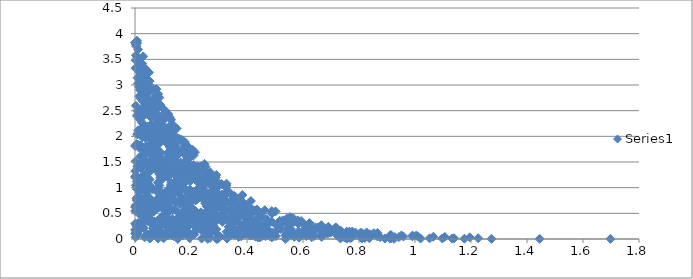
| Category | Series 0 |
|---|---|
| 0.03716779105537421 | 1.003 |
| 0.008822513951496299 | 0.594 |
| 0.017440346820701655 | 1.151 |
| 0.17022369226318276 | 0.327 |
| 0.12895083027089796 | 0.157 |
| 0.09529452116617862 | 0.103 |
| 0.17792396358843135 | 1.823 |
| 0.00026709726787869123 | 0.545 |
| 0.5037541486432635 | 0.274 |
| 0.022506898909260813 | 0.782 |
| 0.8271030406833584 | 0.128 |
| 0.24890674233535257 | 1.345 |
| 0.060093010679022854 | 2.917 |
| 0.22339347148819338 | 1.296 |
| 0.3895400718604784 | 0.631 |
| 0.14147961460940833 | 1.745 |
| 0.9105913933228816 | 0.06 |
| 0.30898676331521885 | 0.863 |
| 0.15679617692178696 | 0.185 |
| 0.08033601282501691 | 2.001 |
| 0.2502979704826458 | 0.779 |
| 0.06808265911801281 | 1.626 |
| 0.5827822408973338 | 0.098 |
| 0.3293461391938041 | 0.731 |
| 0.5535265823665415 | 0.425 |
| 0.11116832625523443 | 0.394 |
| 0.8756790933497893 | 0.037 |
| 0.47677865397592234 | 0.172 |
| 0.35409245493574093 | 0.819 |
| 0.0020778300588985828 | 3.826 |
| 0.02966008064252477 | 3.035 |
| 0.17051384992014326 | 0.683 |
| 0.05861140684196604 | 2.684 |
| 0.12362721254603497 | 1.335 |
| 0.381937015799947 | 0.609 |
| 0.06816264699061637 | 1.785 |
| 0.11652623806145941 | 0.757 |
| 0.10225927061371172 | 0.015 |
| 0.11679399065044489 | 1.341 |
| 0.35570513184533514 | 0.197 |
| 0.006196184182909808 | 1.18 |
| 0.031524972638640174 | 1.04 |
| 0.17890876989443738 | 0.57 |
| 0.245337641208643 | 0.964 |
| 0.07865409892080753 | 2.6 |
| 0.29899747610851335 | 0.788 |
| 0.40432980913844796 | 0.606 |
| 0.249834324769076 | 1.316 |
| 0.0959753202738611 | 0.437 |
| 0.08106289892159264 | 0.981 |
| 0.7306157474795294 | 0.08 |
| 0.5461467781380296 | 0.043 |
| 0.6066587686294266 | 0.203 |
| 0.3124660066139574 | 0.334 |
| 0.23462266587301703 | 0.183 |
| 0.1013118378665841 | 0.428 |
| 0.16136983917486147 | 0.312 |
| 0.17910867924870708 | 1.787 |
| 0.18288134163199576 | 0.504 |
| 0.7335642219753171 | 0.163 |
| 0.02612233544202179 | 1.427 |
| 0.055472756976770704 | 1.456 |
| 0.1382115806041153 | 0.057 |
| 0.33825774308012385 | 0.322 |
| 0.11018860445374318 | 1.544 |
| 0.38530447687380276 | 0.273 |
| 0.3677947456910518 | 0.538 |
| 0.006974025406046639 | 2.398 |
| 0.11286268094486931 | 0.652 |
| 0.025795917813539345 | 1.09 |
| 0.32067438395224784 | 0.408 |
| 0.01698311568460561 | 2.33 |
| 0.19594917026551936 | 1.405 |
| 1.0198910380000974 | 0.009 |
| 0.053247826091861954 | 0.796 |
| 0.1520199435705219 | 0.531 |
| 0.02400793750252171 | 2.098 |
| 0.010206159170048886 | 3.028 |
| 0.1430537871859116 | 1.381 |
| 0.13377346740702775 | 0.394 |
| 0.33537718631001906 | 0.916 |
| 0.6548392543937742 | 0.227 |
| 0.3829382441158842 | 0.463 |
| 0.005245590731129907 | 0.797 |
| 0.48086529905668535 | 0.061 |
| 0.21635298919688242 | 0.751 |
| 0.2855961458978222 | 0.956 |
| 0.28994169256592467 | 0.191 |
| 0.11744493646571584 | 0.095 |
| 0.6458889710088062 | 0.196 |
| 0.27151481187076737 | 0.746 |
| 0.18226509787742487 | 0.211 |
| 0.02852945662145855 | 2.754 |
| 0.00013079454320566965 | 1.813 |
| 0.22524912294621693 | 1.099 |
| 1.1956743073371698 | 0.032 |
| 0.05918327649251201 | 0.126 |
| 0.10462263162822266 | 1.259 |
| 0.10511013658130071 | 1.967 |
| 0.36283538470530247 | 0.133 |
| 0.15497898951619157 | 0.887 |
| 0.35753960904721327 | 0.791 |
| 0.24090935061974092 | 1.392 |
| 0.07127850701558403 | 1.57 |
| 0.14923120332300427 | 1.762 |
| 0.26710071894973947 | 0.119 |
| 0.08736728220929026 | 1.042 |
| 0.13260849562084326 | 0.165 |
| 0.08284844797718813 | 0.896 |
| 0.1458223046683311 | 1.873 |
| 0.18817317799327019 | 0.865 |
| 0.0020434962603495775 | 1.513 |
| 0.09101854342133854 | 2.587 |
| 0.07609185082655578 | 2.064 |
| 0.2942769087865759 | 1.088 |
| 0.29906369066180527 | 1.083 |
| 0.149153338595426 | 1.32 |
| 0.38542013438350786 | 0.666 |
| 0.4413566355533724 | 0.494 |
| 0.07306176098024425 | 2.21 |
| 0.3494748110921651 | 0.43 |
| 0.08276751506915996 | 0.19 |
| 0.22712539898009598 | 0.902 |
| 0.0006745500513479101 | 1.323 |
| 0.17262999416177874 | 1.005 |
| 0.6230589331876341 | 0.309 |
| 0.1547682777703408 | 0.17 |
| 0.7336054182727688 | 0.011 |
| 0.07923835660876469 | 2.66 |
| 0.41115429861618336 | 0.491 |
| 0.11034985703787542 | 0.297 |
| 0.040551021394957504 | 0.888 |
| 0.1875877412656188 | 1.487 |
| 0.19464441217544154 | 0.018 |
| 0.0028589166457402304 | 2.596 |
| 0.08918855800100119 | 1.513 |
| 0.3686093808253029 | 0.453 |
| 0.0239982620997441 | 2.545 |
| 0.05214795206652271 | 0.641 |
| 0.5833180298340916 | 0.297 |
| 0.05480160666144429 | 2.138 |
| 0.23628357006895226 | 1.417 |
| 0.11619212245185592 | 1.203 |
| 0.4272434878211761 | 0.366 |
| 0.1499827470340684 | 1.155 |
| 0.3405440371813204 | 0.403 |
| 0.1720330971606895 | 0.31 |
| 0.033279440813235854 | 0.367 |
| 0.1946025702511996 | 0.268 |
| 0.7178854686342163 | 0.226 |
| 0.12884609317756662 | 0.737 |
| 0.2885427520475441 | 1.202 |
| 0.31812049561085787 | 0.848 |
| 0.14779922449262725 | 1.145 |
| 0.31335921348907914 | 0.756 |
| 0.04932888710436688 | 2.037 |
| 0.7422273057086468 | 0.076 |
| 0.5598810613250808 | 0.107 |
| 0.29088883487643735 | 0.003 |
| 0.3557075392490004 | 0.328 |
| 0.1780591453059112 | 1.802 |
| 0.7193530408202823 | 0.217 |
| 0.11093221485179029 | 0.491 |
| 1.2256007013273058 | 0.016 |
| 0.03938512955973538 | 1.669 |
| 0.09105509829613553 | 0.393 |
| 0.05892334042832206 | 0.631 |
| 0.13584251992623664 | 1.58 |
| 0.014068779985967568 | 0.295 |
| 0.0936399020989678 | 1.146 |
| 0.3622323048185482 | 0.44 |
| 0.1530639118228843 | 1.331 |
| 0.8363566081524443 | 0.017 |
| 0.2744490574938887 | 0.338 |
| 0.19484377101761904 | 0.907 |
| 0.47801289767294725 | 0.308 |
| 0.8397731794458401 | 0.092 |
| 0.22163530127918993 | 1.336 |
| 0.10863243078479147 | 2.499 |
| 0.11908949911724052 | 2.432 |
| 0.019912145491013493 | 0.458 |
| 0.27168919568188227 | 0.409 |
| 0.3991621883068954 | 0.501 |
| 0.0034325451189713683 | 1.236 |
| 1.697984097208112 | 0.002 |
| 0.07634959802859953 | 2.45 |
| 0.11196156723098348 | 0.14 |
| 0.16071668767669117 | 0.68 |
| 0.08535568177087063 | 1.851 |
| 0.058697802035076095 | 2.235 |
| 0.03775842040024851 | 1.97 |
| 0.37683912678513254 | 0.458 |
| 0.03895799616460039 | 1.19 |
| 0.1730643470640195 | 1.284 |
| 0.22361830337121064 | 1.414 |
| 0.756488085402464 | 0.091 |
| 0.612011741465729 | 0.057 |
| 0.44596541491924946 | 0.085 |
| 0.27468770737461673 | 0.681 |
| 0.1697849161967167 | 1.012 |
| 0.0764582020089775 | 2.92 |
| 0.03943157331568232 | 1.811 |
| 0.12940509774165765 | 1.092 |
| 0.5689781128821074 | 0.041 |
| 0.07300009264635163 | 0.564 |
| 0.0010446542353439487 | 1.221 |
| 0.5505899982377189 | 0.271 |
| 0.2330120737092051 | 1.079 |
| 0.3980308495811225 | 0.155 |
| 0.28270408481594433 | 0.155 |
| 0.19607328636718516 | 0.966 |
| 0.055104085455140124 | 0.311 |
| 0.3158976162985328 | 0.604 |
| 0.028335296095916677 | 2.392 |
| 0.044759114639264734 | 2.493 |
| 0.22155434159775922 | 0.771 |
| 1.0522134636277525 | 0.013 |
| 0.10131654618310945 | 2.01 |
| 0.24424135845833136 | 1.348 |
| 0.04394392483629507 | 0.353 |
| 0.26808694218748563 | 0.023 |
| 0.17528862848102417 | 1.669 |
| 0.13596899018793288 | 0.088 |
| 0.026837098217934296 | 2.907 |
| 0.6140876071222231 | 0.229 |
| 0.2502499511543098 | 0.464 |
| 0.06080359942958964 | 2.02 |
| 0.8924941658065707 | 0.009 |
| 0.01922850289631349 | 3.32 |
| 0.24874327869718788 | 0.137 |
| 0.45877686867636175 | 0.198 |
| 0.2702524136993201 | 0.315 |
| 0.9911504805643827 | 0.067 |
| 0.3667194221961769 | 0.341 |
| 0.1281191551737167 | 1.267 |
| 0.21848779366111384 | 0.165 |
| 0.043171394131907265 | 0.5 |
| 0.3438430820743103 | 0.866 |
| 0.14252941290550034 | 1.821 |
| 0.37642321324947403 | 0.229 |
| 0.26816307991313776 | 1.302 |
| 0.27997516022547575 | 1.027 |
| 0.0562893401099493 | 2.657 |
| 0.025728552335381863 | 3.417 |
| 0.46595198973635943 | 0.056 |
| 0.05378303481719533 | 2.462 |
| 0.5420552719728263 | 0.398 |
| 0.043251053186384454 | 2.735 |
| 0.26290564498261365 | 0.258 |
| 0.028833375186291456 | 0.647 |
| 0.012064280015961255 | 3.438 |
| 1.0090411865269449 | 0.054 |
| 0.003381607281538869 | 0.29 |
| 0.01550398556215852 | 2.782 |
| 0.138999881838892 | 0.269 |
| 0.38339558230897547 | 0.859 |
| 0.25695879837196134 | 1.271 |
| 0.12971052856652157 | 1.362 |
| 0.09713718785048914 | 0.067 |
| 0.14597383380660106 | 1.492 |
| 0.19706833260916073 | 1.123 |
| 0.8096562643309575 | 0.01 |
| 0.06861633694017835 | 1.857 |
| 0.49811927472803125 | 0.068 |
| 0.03928240309270699 | 2.433 |
| 0.0504730490682628 | 1.345 |
| 0.03101425161150037 | 1.255 |
| 0.24410542953311987 | 0.381 |
| 0.2821960674724906 | 1.118 |
| 0.021463063985319598 | 0.787 |
| 0.2617455917209899 | 0.525 |
| 0.08889547019604792 | 2.044 |
| 0.11261755384455845 | 0.299 |
| 0.17749182856709433 | 1.855 |
| 0.04764450486380906 | 1.816 |
| 0.5031948396537179 | 0.056 |
| 0.8403247590286397 | 0.04 |
| 0.690296965879602 | 0.238 |
| 0.12545945177456969 | 1.783 |
| 0.28515777786221563 | 0.453 |
| 0.4402939049402467 | 0.205 |
| 0.2598569962264931 | 0.003 |
| 0.1399414969379703 | 1.803 |
| 0.02579907774972698 | 2.037 |
| 0.1929155879455223 | 0.757 |
| 0.3081127265022092 | 0.478 |
| 0.2618285796804837 | 1.162 |
| 0.5451997041991578 | 0.308 |
| 0.034135566795484025 | 0.034 |
| 0.22854350278876237 | 0.438 |
| 0.22695108041500367 | 1.223 |
| 0.029028356388965573 | 1.747 |
| 0.03713370581039943 | 0.926 |
| 0.03844488595252487 | 2.991 |
| 0.029406822840174256 | 1.213 |
| 0.18241049202749346 | 0.705 |
| 0.09723041491832057 | 0.716 |
| 0.3518108209681101 | 0.381 |
| 0.23575629864084668 | 0.252 |
| 0.1262118214533976 | 0.748 |
| 0.26011650770147376 | 0.432 |
| 0.2516788758774388 | 1.411 |
| 0.23547073507659688 | 0.52 |
| 0.07485947744282745 | 0.301 |
| 0.5466850526001145 | 0.211 |
| 0.19724550649564637 | 1.753 |
| 0.43030904119972746 | 0.047 |
| 0.01571909132883207 | 0.174 |
| 0.17796167315414027 | 1.889 |
| 0.09467851680912315 | 1.454 |
| 0.031203615662103012 | 2.147 |
| 0.4642817238532101 | 0.387 |
| 0.7797710987891713 | 0.078 |
| 0.35819470930476893 | 0.727 |
| 0.5897184866335335 | 0.047 |
| 0.4889151535941082 | 0.338 |
| 0.12175787851587304 | 1.268 |
| 0.1881024254166603 | 1.804 |
| 0.07292503684942839 | 0.744 |
| 0.0022231464086416566 | 3.481 |
| 0.09040887204534352 | 0.839 |
| 0.5202870509027124 | 0.195 |
| 0.6670391041519752 | 0.041 |
| 1.0042767724553114 | 0.066 |
| 0.488552532201586 | 0.544 |
| 0.13260030746197266 | 0.072 |
| 0.020057714630300802 | 1.614 |
| 0.08883654509188993 | 0.241 |
| 0.003992225088224762 | 0.137 |
| 0.18839935398352578 | 0.242 |
| 0.7475943097023736 | 0.033 |
| 0.25606257571745183 | 0.266 |
| 0.27371642358528514 | 0.412 |
| 0.11918552155827256 | 0.86 |
| 0.8202883268615183 | 0.017 |
| 0.02961133817398603 | 3.191 |
| 0.2801048426662763 | 0.32 |
| 0.14995982192992824 | 1.216 |
| 0.19692163934186185 | 0.366 |
| 0.10511195209876262 | 1.546 |
| 0.5934911871697041 | 0.349 |
| 0.01694383420503283 | 0.979 |
| 0.45131160250555313 | 0.048 |
| 0.3122530354347572 | 0.806 |
| 0.17139244416193486 | 1.086 |
| 0.2815709871404968 | 0.34 |
| 0.0016469690047473844 | 1.199 |
| 0.2859885000924808 | 0.721 |
| 0.16595864625938825 | 0.944 |
| 0.3309198108981538 | 0.085 |
| 0.08974878711307308 | 0.919 |
| 0.1150413381362838 | 1.888 |
| 0.11716615477223524 | 0.644 |
| 0.06193881127510273 | 2.575 |
| 0.8657385135362866 | 0.05 |
| 0.008068520955331887 | 1.414 |
| 0.20287094209759182 | 0.473 |
| 0.27909958880454533 | 0.192 |
| 0.021122531715865502 | 1.039 |
| 0.007595292799149603 | 3.82 |
| 0.11082743315891765 | 0.686 |
| 0.2138652953841197 | 0.805 |
| 1.1325389757008482 | 0.008 |
| 0.7225976298654383 | 0.066 |
| 0.03995966811524169 | 2.761 |
| 1.1062645493199872 | 0.042 |
| 0.39752387226475466 | 0.444 |
| 0.010986536087277562 | 2.118 |
| 0.05203766892625499 | 2.396 |
| 0.43529640128976366 | 0.576 |
| 0.7759608099303881 | 0.145 |
| 0.0021260168517038716 | 0.035 |
| 0.002666228610356424 | 0.656 |
| 0.4021857021678105 | 0.456 |
| 0.0827803206851457 | 0.01 |
| 0.08308544189366565 | 1.671 |
| 0.22444312684525722 | 0.391 |
| 0.5018554989098276 | 0.537 |
| 0.06853552002282795 | 2.692 |
| 0.3979070827768982 | 0.497 |
| 0.8532637877803437 | 0.114 |
| 0.2380104381719759 | 0.009 |
| 0.3807326176784516 | 0.22 |
| 0.00712907373995764 | 3.863 |
| 0.05384232653302219 | 0.01 |
| 0.21295775935913677 | 0.251 |
| 0.2786123533464632 | 0.265 |
| 0.2841939452605816 | 0.503 |
| 0.911461207609207 | 0.072 |
| 0.4340562192297507 | 0.177 |
| 0.25710543363966665 | 0.782 |
| 0.10247460690875075 | 1.205 |
| 0.7725083907962065 | 0.025 |
| 0.4709741726834923 | 0.386 |
| 0.17006921457682703 | 0.26 |
| 0.13803577999090855 | 0.886 |
| 0.32370911358471666 | 1.027 |
| 0.016229788072481356 | 0.543 |
| 0.025980905838937186 | 1.042 |
| 0.11790758108859042 | 0.073 |
| 0.9139609633857955 | 0.02 |
| 0.11890164180535978 | 0.515 |
| 0.33139696672257823 | 0.926 |
| 0.41702086525999854 | 0.232 |
| 0.23398124858026345 | 0.213 |
| 0.020624733829223706 | 1.824 |
| 0.04345683338732543 | 2.189 |
| 0.5976692322756694 | 0.32 |
| 0.7158433667414225 | 0.221 |
| 0.024327264538763087 | 2.273 |
| 0.005685869806571406 | 1.848 |
| 0.2917686035849131 | 0.909 |
| 0.04084030600399222 | 1.002 |
| 0.5312813353171172 | 0.333 |
| 0.08891631622923195 | 1.578 |
| 0.05474775009133251 | 2.168 |
| 0.1421282457922648 | 0.572 |
| 0.035837866035855634 | 0.64 |
| 0.34603145032225047 | 0.53 |
| 0.09941171173777597 | 0.883 |
| 0.20312725862471187 | 0.367 |
| 0.6306362521282733 | 0.203 |
| 0.4123611103623083 | 0.345 |
| 0.1463599413614377 | 1.507 |
| 0.3260970376300381 | 1.049 |
| 0.01227492071198039 | 2.491 |
| 0.10140303820866761 | 2.059 |
| 0.009303692707600583 | 0.654 |
| 0.10621720557090165 | 0.737 |
| 0.7010732348205317 | 0.167 |
| 0.6982352904308397 | 0.125 |
| 1.2732761207781422 | 0.003 |
| 0.3479677728534355 | 0.2 |
| 0.04251380113754696 | 0.5 |
| 0.5417889625997556 | 0.117 |
| 0.09230618546415853 | 2.588 |
| 0.11047957152993328 | 1.924 |
| 0.4152169437105103 | 0.067 |
| 0.01969334936462216 | 2.406 |
| 0.2879424483647088 | 0.812 |
| 0.4128390716226218 | 0.078 |
| 0.028072535174833706 | 2.684 |
| 0.060673217469737625 | 2.946 |
| 0.09312166202696877 | 2.347 |
| 0.2467391068889866 | 0.495 |
| 0.2486951579787339 | 1.137 |
| 0.7839242012826562 | 0.07 |
| 0.1835436744465571 | 1.133 |
| 0.6646996710072121 | 0.153 |
| 0.09783521253804374 | 0.739 |
| 0.04189776383318772 | 0.723 |
| 0.02603695020988475 | 1.081 |
| 1.0974891644731306 | 0.011 |
| 0.20232650761918547 | 1.167 |
| 0.0007017476355041736 | 0.298 |
| 0.08614202769742578 | 1.993 |
| 0.08984454155099916 | 2.615 |
| 0.03179476107291295 | 2.112 |
| 0.08193974413929282 | 0.183 |
| 0.21135011629478526 | 0.087 |
| 0.9585460755699174 | 0.048 |
| 0.16632243070270006 | 0.503 |
| 0.29458671818147025 | 0.61 |
| 0.3127447116179327 | 0.867 |
| 0.2365378385694493 | 0.475 |
| 0.18367164417436657 | 0.13 |
| 0.6321951526103338 | 0.173 |
| 0.0454305544480689 | 0.09 |
| 0.4458042901326202 | 0.46 |
| 0.2018090609809474 | 1.308 |
| 0.5859569090616136 | 0.027 |
| 0.04906398215872399 | 1.159 |
| 0.41301916704339436 | 0.485 |
| 0.25062453496038334 | 0.379 |
| 0.5939715387477464 | 0.102 |
| 0.23413190686269184 | 0.467 |
| 0.4887596240539266 | 0.495 |
| 0.09445002207283087 | 1.371 |
| 0.16269546904348786 | 1.442 |
| 0.6653577440568421 | 0.147 |
| 0.5200700031214228 | 0.271 |
| 0.4195118187250483 | 0.34 |
| 0.7657519941167241 | 0.143 |
| 0.210370943572554 | 0.48 |
| 0.020695306067518696 | 3.146 |
| 0.13509006018958594 | 0.973 |
| 0.2201405606101229 | 1.379 |
| 0.17417842724000926 | 1.384 |
| 0.25551712955861555 | 0.64 |
| 0.10140871169402188 | 1.339 |
| 0.2927138460542423 | 1.04 |
| 0.026327871316478294 | 1.98 |
| 0.9238489467627088 | 0.018 |
| 0.26974148342634086 | 0.386 |
| 0.40902469682625375 | 0.618 |
| 1.1764100534764306 | 0.007 |
| 0.11595483535451995 | 2.005 |
| 0.12277817779949597 | 0.34 |
| 0.3372348218994281 | 0.577 |
| 0.13602180480439377 | 0.776 |
| 0.008208924567196988 | 2.497 |
| 0.10463018861818472 | 0.559 |
| 0.20852764962788065 | 1.441 |
| 0.047916422869177036 | 3.254 |
| 0.062033854383424625 | 1.655 |
| 0.24421485738198445 | 1.051 |
| 0.5601967209651089 | 0.367 |
| 0.030909691733109843 | 2.802 |
| 0.03489514419552418 | 0.556 |
| 0.1137260270979722 | 1.43 |
| 0.2567070768957062 | 0.514 |
| 0.025545773585839135 | 3.032 |
| 0.06206303932683439 | 0.968 |
| 0.13680830848796732 | 1.523 |
| 0.26566211189441313 | 0.63 |
| 0.6986633638158869 | 0.128 |
| 0.35152629538614116 | 0.211 |
| 0.18299766864462877 | 0.271 |
| 0.1229255713920644 | 2.194 |
| 0.22229281001258033 | 0.968 |
| 0.22236679529137746 | 0.399 |
| 0.07832633893802536 | 0.689 |
| 0.20922581183316494 | 1.63 |
| 0.003515012872298476 | 3.579 |
| 0.3988778402662023 | 0.606 |
| 0.13794422636950995 | 2.209 |
| 0.30359212337576474 | 0.046 |
| 0.00024369786268822502 | 0.105 |
| 0.43923498052058685 | 0.321 |
| 0.28573720691190085 | 0.863 |
| 0.1916312212293133 | 0.335 |
| 0.12439715066635122 | 1.948 |
| 0.06065735016213561 | 1.575 |
| 0.4687810609422315 | 0.188 |
| 0.37917048567553435 | 0.052 |
| 0.10402270084478975 | 0.461 |
| 0.01934661198154567 | 2.741 |
| 0.08850128107923064 | 2.125 |
| 0.0860364260035867 | 0.387 |
| 0.0200373388733097 | 0.737 |
| 0.07349479307507259 | 0.703 |
| 0.00484295620535174 | 0.254 |
| 0.07473947689779438 | 0.05 |
| 0.0727334311705122 | 2.184 |
| 0.03026840358375242 | 2.24 |
| 0.24307560027708563 | 0.213 |
| 0.23644017947399568 | 0.809 |
| 0.08428844760715917 | 2.768 |
| 0.1690959306738582 | 1.916 |
| 0.06924244361000116 | 2.122 |
| 0.018647367393502205 | 3.381 |
| 0.2703180636574822 | 0.834 |
| 0.47896349731524457 | 0.13 |
| 0.04281803737592428 | 1.082 |
| 0.4458108288756361 | 0.031 |
| 0.05959041871925094 | 2.591 |
| 0.28793129532308914 | 0.968 |
| 0.01090954729841838 | 1.2 |
| 0.03110876026707476 | 0.208 |
| 0.32875787030764286 | 0.008 |
| 0.08938607191049082 | 0.932 |
| 0.14650648654445952 | 1.603 |
| 0.2608201698767283 | 1.22 |
| 0.41689901936861634 | 0.312 |
| 0.4523581504035623 | 0.215 |
| 0.41022901998721245 | 0.169 |
| 0.06621160484938358 | 2.707 |
| 0.20613127344703905 | 0.832 |
| 0.6666276156376078 | 0.094 |
| 0.20246054858403065 | 0.741 |
| 0.0369340886537558 | 0.689 |
| 0.39271556392526347 | 0.42 |
| 0.06936148637896583 | 1.902 |
| 0.3791487887741288 | 0.235 |
| 0.2561990080227293 | 0.171 |
| 0.053205598629228815 | 1.953 |
| 0.30881711037863124 | 1.074 |
| 0.37010590724318637 | 0.04 |
| 0.1384244599484686 | 0.346 |
| 0.9119017637282334 | 0.008 |
| 0.3985137856393509 | 0.334 |
| 0.3075467911978684 | 0.445 |
| 0.4054748043526955 | 0.153 |
| 0.26347843229208173 | 0.218 |
| 0.06754231831669748 | 2.176 |
| 0.15631461261375254 | 1.957 |
| 0.3945807839377512 | 0.431 |
| 0.20601368003504777 | 0.846 |
| 0.36707862275444064 | 0.448 |
| 0.6903728353935248 | 0.173 |
| 0.5371036356967726 | 0.071 |
| 0.2613392389357408 | 1.2 |
| 0.18523688202529784 | 1.318 |
| 0.17003114304811737 | 1.021 |
| 0.2259323182163849 | 1.163 |
| 0.014820483516724851 | 1.142 |
| 0.4084977634419935 | 0.072 |
| 0.29535714051936107 | 1.046 |
| 0.04946648982082836 | 3.24 |
| 0.009989576706870232 | 2.426 |
| 0.02953273859224491 | 2.18 |
| 0.07855939861233441 | 1.754 |
| 0.015367204470538097 | 0.914 |
| 0.3274039929992757 | 0.521 |
| 0.0865414461385905 | 2.752 |
| 0.37568946457676733 | 0.772 |
| 0.14136495205770552 | 1.46 |
| 0.7719703459091907 | 0.042 |
| 0.42259733916803843 | 0.077 |
| 0.9117313591729422 | 0.012 |
| 0.5109406584072923 | 0.185 |
| 0.13316844671809802 | 0.98 |
| 0.12583522712609496 | 0.808 |
| 0.1414237075625851 | 0.178 |
| 0.12881657146154057 | 2.323 |
| 0.2811523954593672 | 1.093 |
| 0.7234711610517045 | 0.119 |
| 0.06710950189339031 | 0.305 |
| 0.3551149613065293 | 0.836 |
| 0.2884692038633557 | 0.179 |
| 0.7305384314668211 | 0.071 |
| 0.09156883628841864 | 1.458 |
| 0.1443287637412168 | 0.968 |
| 0.09000720305561594 | 0.825 |
| 0.00045522408520164934 | 0.622 |
| 0.1430391567268894 | 1.928 |
| 0.4884524441579371 | 0.03 |
| 0.1503436901808152 | 0.275 |
| 0.667943581933526 | 0.208 |
| 0.09836432205489716 | 2.322 |
| 0.23794777234192988 | 0.433 |
| 0.07074612333207442 | 2.541 |
| 0.06525923446292119 | 0.206 |
| 0.047066406100545556 | 1.784 |
| 0.46260284970956894 | 0.246 |
| 0.29945972928597203 | 1.047 |
| 0.30184250236928983 | 0.629 |
| 0.10660157803332408 | 2.337 |
| 0.49413178195389507 | 0.051 |
| 0.5669103345522835 | 0.335 |
| 0.2649593771050686 | 0.102 |
| 0.03272688184005703 | 2.877 |
| 0.5275325058958806 | 0.362 |
| 0.17173965257968307 | 0.522 |
| 0.08949807706263732 | 1.658 |
| 0.22270332022894931 | 0.404 |
| 0.05754733258541032 | 2.533 |
| 0.16033951626925477 | 1.678 |
| 0.08446855667652288 | 2.237 |
| 0.28002717728606213 | 0.946 |
| 0.16308443015469473 | 1.491 |
| 0.4574317806984143 | 0.245 |
| 0.2857844806022694 | 0.813 |
| 1.0655055919595027 | 0.044 |
| 0.02653592899649379 | 2.481 |
| 0.009051594917975444 | 3.539 |
| 0.2601976832597061 | 0.706 |
| 0.0005468080459277795 | 3.83 |
| 0.6191797363235508 | 0.16 |
| 0.08168343224206145 | 2.556 |
| 0.17183099561716614 | 1.229 |
| 0.043841332366627746 | 0.088 |
| 0.056172639576574916 | 1.693 |
| 0.006417619643961405 | 1.121 |
| 0.17668183999773568 | 0.515 |
| 0.12063090898959207 | 2.107 |
| 0.1513704032609573 | 0.106 |
| 0.019050413725471442 | 2.911 |
| 0.2596739744768891 | 0.043 |
| 0.8659637118888498 | 0.119 |
| 0.3899513123391198 | 0.668 |
| 0.3023756059242577 | 0.772 |
| 0.19003096295689123 | 1.595 |
| 0.31256766891833804 | 0.363 |
| 0.26493089474688414 | 0.736 |
| 0.12407058372670868 | 1.868 |
| 0.05208888321051314 | 3.076 |
| 0.9425964561073 | 0.037 |
| 0.09110218439758834 | 1.689 |
| 0.44599909948806776 | 0.499 |
| 0.4387179005367751 | 0.034 |
| 0.08279963776231446 | 2.393 |
| 0.21621493385995688 | 0.541 |
| 0.2168209167736261 | 0.86 |
| 0.039469679391143646 | 2.563 |
| 0.1958156169797146 | 1.585 |
| 0.6695281163958579 | 0.199 |
| 0.029614567784050753 | 1.484 |
| 0.021686629391309383 | 1.377 |
| 0.6656704410626394 | 0.27 |
| 0.2680973013430924 | 1.063 |
| 0.03837573899237349 | 0.802 |
| 0.0028412069657242273 | 1.045 |
| 0.6291456357721199 | 0.074 |
| 0.20143117871469052 | 1.215 |
| 0.640128781551175 | 0.06 |
| 0.04253381376728603 | 1.132 |
| 0.08662422003861742 | 0.623 |
| 0.1422028302106584 | 0.741 |
| 0.05539207939954775 | 1.646 |
| 0.058855561606273435 | 2.553 |
| 0.07513126455683351 | 0.74 |
| 0.03927796780401924 | 2.477 |
| 0.02996889697362653 | 0.225 |
| 0.21924634863375328 | 0.516 |
| 0.031212358866408593 | 1.25 |
| 0.2609813805701413 | 0.452 |
| 0.20023826299274752 | 1.255 |
| 0.2768287648726823 | 0.741 |
| 0.9270295356629819 | 0.036 |
| 0.44427879571836504 | 0.415 |
| 0.07473059675447424 | 0.737 |
| 0.35370848185810777 | 0.149 |
| 0.3401052265809586 | 0.579 |
| 0.3811585211312444 | 0.228 |
| 0.08619839129250234 | 1.267 |
| 0.8105044339543246 | 0.116 |
| 0.2734251021705494 | 0.635 |
| 0.019225429147420252 | 1.073 |
| 0.14843543763516012 | 0.241 |
| 0.04212355516913656 | 1.432 |
| 0.10016220603370796 | 1.479 |
| 0.31714531385936606 | 0.602 |
| 0.3171852093661614 | 0.673 |
| 0.2329168931380653 | 0.338 |
| 0.35236592756984925 | 0.716 |
| 0.5607367861029855 | 0.126 |
| 0.2648349523808092 | 0.892 |
| 0.014167054699540283 | 3.518 |
| 0.05266261939361827 | 0.375 |
| 0.3962679677553977 | 0.101 |
| 0.0563051644993749 | 2.383 |
| 0.32726627647498113 | 0.141 |
| 0.7273994949452444 | 0.054 |
| 0.06591782823760127 | 1.454 |
| 0.2739531132013039 | 1.094 |
| 0.043654864414932826 | 0.54 |
| 0.16198770945229665 | 0.464 |
| 0.14220011817993095 | 0.985 |
| 0.7367694790588377 | 0.149 |
| 0.1489628100003106 | 1.266 |
| 0.1174133506219431 | 0.614 |
| 0.4917498073513423 | 0.123 |
| 0.14636290064002377 | 1.228 |
| 0.23245443657325754 | 1.344 |
| 0.2584171715543306 | 0.164 |
| 0.03593680629754447 | 1.188 |
| 0.046382117431815584 | 1.286 |
| 0.07706614963302562 | 2.182 |
| 0.20581536036724696 | 1.737 |
| 0.28444389057821806 | 0.156 |
| 0.010446828952247416 | 0.31 |
| 0.01807977968133907 | 2.902 |
| 0.1855581621243676 | 1.551 |
| 0.06879734025197451 | 0.544 |
| 0.12522878263326084 | 1.643 |
| 0.16931997174529348 | 0.067 |
| 0.1743634376037247 | 0.121 |
| 0.15179274381185323 | 1.05 |
| 0.1865638272299198 | 0.928 |
| 0.02912573091966415 | 3.557 |
| 0.23595356151488303 | 0.202 |
| 0.14864519083587416 | 0.723 |
| 0.05538348794641192 | 1.036 |
| 0.05215098133641336 | 1.159 |
| 0.11016627236550376 | 2.16 |
| 0.21819069256637127 | 0.946 |
| 0.09151994010632128 | 1.473 |
| 0.07505713765451004 | 2.596 |
| 0.5530621721139625 | 0.103 |
| 0.10254677805755594 | 2.191 |
| 0.07966791136858474 | 2.669 |
| 0.05927072554777456 | 0.506 |
| 0.11158996801571189 | 1.463 |
| 0.16662898531857046 | 0.15 |
| 0.2431224862320272 | 1.187 |
| 0.08615865440387893 | 0.164 |
| 0.723763814473683 | 0.188 |
| 0.7679619087653283 | 0.019 |
| 0.11852981566265258 | 0.963 |
| 0.03470701378529852 | 2.163 |
| 0.2953473752510192 | 0.005 |
| 0.01477302376735774 | 0.78 |
| 0.7542065012570087 | 0.133 |
| 0.8053028042414346 | 0.122 |
| 0.5837572143838259 | 0.147 |
| 0.1371868411047044 | 2.04 |
| 0.026857655030495805 | 2.465 |
| 0.19066940173853542 | 0.908 |
| 0.18482861980062465 | 1.6 |
| 0.06957747802612516 | 2.69 |
| 0.014405646881522263 | 2.964 |
| 0.18145693447563707 | 1.728 |
| 0.18814421770089385 | 0.144 |
| 0.536806590287363 | 0.001 |
| 0.03966676063010809 | 0.706 |
| 0.011034880699533588 | 3.691 |
| 1.1396351310096113 | 0.013 |
| 0.07319342157224563 | 2.791 |
| 0.03417718211563455 | 0.351 |
| 0.09959573088362368 | 0.336 |
| 0.1856126071223394 | 0.663 |
| 0.021028839770470414 | 2.145 |
| 0.4586706399800608 | 0.069 |
| 0.01671813227791694 | 3.244 |
| 0.33551786972903325 | 0.229 |
| 0.0017378800530706525 | 3.328 |
| 0.1280050588261754 | 1.051 |
| 0.02766898912569426 | 2.729 |
| 0.8135953621605108 | 0.08 |
| 0.29913192547177386 | 0.062 |
| 0.044612513005050355 | 2.651 |
| 0.10770982287494894 | 2.463 |
| 0.3382506349420586 | 0.06 |
| 0.18305217238249577 | 0.624 |
| 0.2044612213059334 | 1.696 |
| 0.35998597947585764 | 0.659 |
| 0.9143442322121333 | 0.076 |
| 0.20548778630962627 | 0.076 |
| 0.008752105379052027 | 3.14 |
| 0.22432527534550564 | 0.973 |
| 0.15253685259854807 | 0.087 |
| 0.4941096059831081 | 0.063 |
| 0.004505409893572001 | 3.756 |
| 0.756940564406272 | 0.139 |
| 0.5641575663696542 | 0.408 |
| 0.06707405312696392 | 2.487 |
| 0.15274628335510018 | 0.001 |
| 0.0301993843154612 | 2.943 |
| 0.7539701308604306 | 0.047 |
| 0.631284048140841 | 0.037 |
| 0.18073025988457606 | 1.637 |
| 0.030669303153514203 | 3.327 |
| 0.04138557993764964 | 2.757 |
| 0.8110844397505262 | 0.041 |
| 0.03305181115801961 | 1.172 |
| 0.1458188343854331 | 1.865 |
| 0.11642686737308956 | 0.22 |
| 0.011892797736220175 | 1.835 |
| 0.6663054576111382 | 0.05 |
| 0.053741630177956065 | 1.977 |
| 0.38945079937901617 | 0.693 |
| 0.004317924533365498 | 3.82 |
| 0.18156149086365578 | 1.332 |
| 0.13570360306778886 | 0.569 |
| 0.6685675202069643 | 0.077 |
| 0.41249918778916284 | 0.207 |
| 0.6882097107032576 | 0.107 |
| 0.6446224377901701 | 0.228 |
| 0.7519360157675881 | 0.09 |
| 0.22926095976610036 | 1.398 |
| 0.016650143165826758 | 1.165 |
| 0.6716813220293155 | 0.175 |
| 0.19156521066294394 | 0.942 |
| 0.21974976851150446 | 0.272 |
| 0.1475952286228914 | 0.206 |
| 0.32672588664949415 | 1.077 |
| 0.013969803087675939 | 1.782 |
| 0.2749274218686401 | 0.656 |
| 0.038368338621876885 | 3.13 |
| 0.08381938543723422 | 2.3 |
| 0.05789785492506088 | 1.78 |
| 0.04276553266439329 | 0.06 |
| 0.29263003680852745 | 0.366 |
| 0.4384006866289388 | 0.041 |
| 0.0999967962373734 | 0.097 |
| 0.3399499607333961 | 0.718 |
| 0.02365904162292105 | 1.497 |
| 0.057565210064972984 | 0.591 |
| 0.20041055812811132 | 0.813 |
| 0.029741787191556485 | 2.984 |
| 0.564393947259276 | 0.13 |
| 0.07349981741026125 | 0.083 |
| 0.25067677982998937 | 0.696 |
| 0.0342010698702004 | 0.98 |
| 0.005540306102903706 | 0.757 |
| 0.1518037505897689 | 1.494 |
| 0.2527683863045071 | 0.849 |
| 0.055149895474396624 | 1.324 |
| 0.42354060292607526 | 0.562 |
| 0.5811418614486245 | 0.362 |
| 0.9253327466957975 | 0.005 |
| 0.2815587204766867 | 0.7 |
| 0.19686447604260154 | 0.473 |
| 0.07981393650785928 | 2.314 |
| 0.28375011239672476 | 1.009 |
| 0.006713397923505759 | 0.974 |
| 0.1638674676344877 | 0.475 |
| 0.056781844182172976 | 1.723 |
| 0.07755428451252747 | 1.346 |
| 0.7346204630415915 | 0.089 |
| 0.4139266665138237 | 0.74 |
| 0.10774800120678771 | 1.453 |
| 0.053455428882881184 | 2.213 |
| 0.11672753907817716 | 1.682 |
| 0.16789054353097121 | 1.102 |
| 0.11859087485591485 | 0.391 |
| 0.08947326319023174 | 1.192 |
| 0.05596355517399937 | 2.41 |
| 0.0813449033358548 | 1.326 |
| 0.011784830156448947 | 1.82 |
| 0.7871409648320598 | 0.126 |
| 0.23576835815797406 | 1.371 |
| 0.0846369042476017 | 1.093 |
| 0.0031366340799164135 | 0.108 |
| 0.18264637183882457 | 0.362 |
| 0.29029565311796174 | 1.247 |
| 0.15130580041824784 | 0.398 |
| 0.19733340891928347 | 0.886 |
| 0.17580738463813428 | 1.771 |
| 0.1036349075852643 | 1.919 |
| 0.24811918028546395 | 1.464 |
| 0.7566309483690216 | 0.006 |
| 0.41440555233878285 | 0.124 |
| 0.11465145492282001 | 1.858 |
| 0.1270394026266867 | 0.311 |
| 0.2565636129505939 | 0.059 |
| 0.012040732951786091 | 2.474 |
| 0.148744496205917 | 2.154 |
| 0.5550977913024033 | 0.202 |
| 0.003143685286979164 | 3.784 |
| 0.13448689229976524 | 1.988 |
| 0.18280130112166887 | 0.571 |
| 0.05179405860962934 | 0.409 |
| 0.2650397018676785 | 0.588 |
| 1.4451505331007757 | 0.003 |
| 0.102055968332248 | 1.958 |
| 0.34220998966717575 | 0.137 |
| 0.05081426148874788 | 0.974 |
| 0.09335222720931663 | 1.401 |
| 0.46340278101474736 | 0.56 |
| 0.3549011356937789 | 0.08 |
| 0.00799051567222216 | 2.039 |
| 0.04261456972393452 | 2.643 |
| 0.5168823068580075 | 0.354 |
| 0.24251787067671485 | 0.885 |
| 0.33557129087831644 | 0.244 |
| 0.08474356232949065 | 0.693 |
| 0.548165284556027 | 0.142 |
| 0.03796816830957779 | 1.52 |
| 0.32224818968822805 | 1.019 |
| 0.1786055294853959 | 1.418 |
| 0.0006066173597640974 | 0.179 |
| 0.06842038797355093 | 0.345 |
| 0.1661181606281148 | 1.935 |
| 0.0827162862775684 | 2.825 |
| 0.21417690814111845 | 1.69 |
| 0.2055796523640406 | 0.594 |
| 0.11863286298392058 | 1.858 |
| 0.1677927238999974 | 0.789 |
| 0.048129019969206946 | 0.691 |
| 0.4345016973070955 | 0.194 |
| 0.08197645062357153 | 1.104 |
| 0.2540286038309828 | 0.515 |
| 0.17902082220314677 | 0.446 |
| 0.19463845681942346 | 0.555 |
| 0.0105211153820309 | 0.101 |
| 0.12593958781564404 | 1.999 |
| 0.9911252357538228 | 0.051 |
| 0.0393317890044447 | 2.533 |
| 0.3158371197933739 | 0.665 |
| 0.23858359535470886 | 0.171 |
| 0.14526794781586777 | 0.718 |
| 0.2058229954505731 | 1.222 |
| 0.12382885209603256 | 2.371 |
| 0.03574611142011506 | 3.327 |
| 0.5543691125113485 | 0.156 |
| 0.3891224313569426 | 0.253 |
| 0.012146806257374517 | 2.072 |
| 0.42594613423012573 | 0.216 |
| 0.04883271025534911 | 2.857 |
| 0.1374031851769821 | 2.102 |
| 0.9517013786099932 | 0.07 |